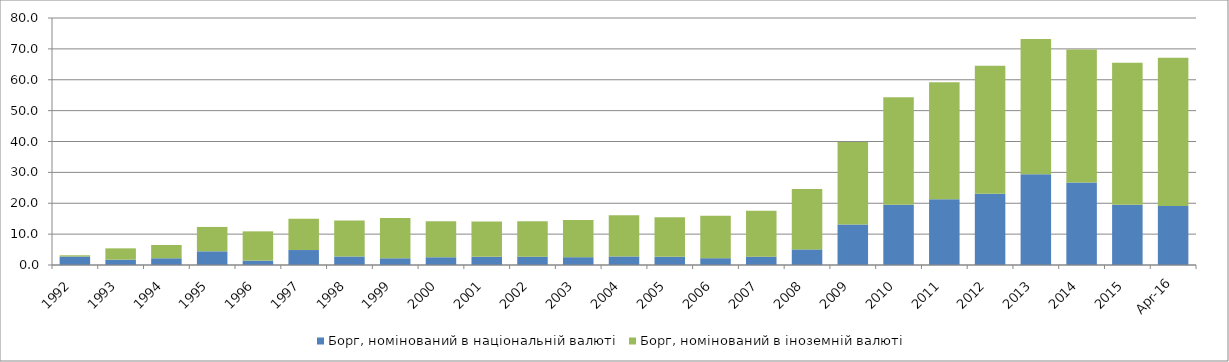
| Category | Борг, номінований в національній валюті | Борг, номінований в іноземній валюті |
|---|---|---|
| 1992.0 | 2.743 | 0.404 |
| 1993.0 | 1.732 | 3.661 |
| 1994.0 | 2.184 | 4.292 |
| 1995.0 | 4.433 | 7.895 |
| 1996.0 | 1.427 | 9.468 |
| 1997.0 | 4.845 | 10.164 |
| 1998.0 | 2.759 | 11.647 |
| 1999.0 | 2.176 | 13.072 |
| 2000.0 | 2.507 | 11.657 |
| 2001.0 | 2.65 | 11.419 |
| 2002.0 | 2.694 | 11.508 |
| 2003.0 | 2.533 | 12.01 |
| 2004.0 | 2.766 | 13.331 |
| 2005.0 | 2.666 | 12.809 |
| 2006.0 | 2.205 | 13.745 |
| 2007.0 | 2.69 | 14.883 |
| 2008.0 | 5.06 | 19.539 |
| 2009.0 | 13.143 | 26.67 |
| 2010.0 | 19.538 | 34.76 |
| 2011.0 | 21.329 | 37.894 |
| 2012.0 | 23.046 | 41.449 |
| 2013.0 | 29.397 | 43.765 |
| 2014.0 | 26.747 | 43.065 |
| 2015.0 | 19.515 | 45.99 |
| 42490.0 | 19.14 | 47.951 |